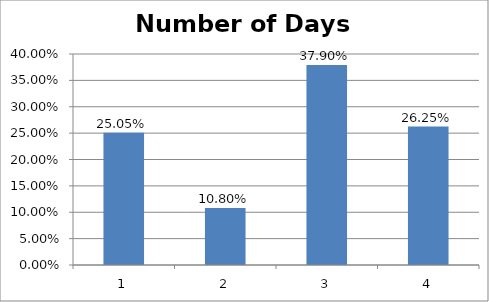
| Category | Number of Days (Absolute) |
|---|---|
| 0 | 0.25 |
| 1 | 0.108 |
| 2 | 0.379 |
| 3 | 0.262 |